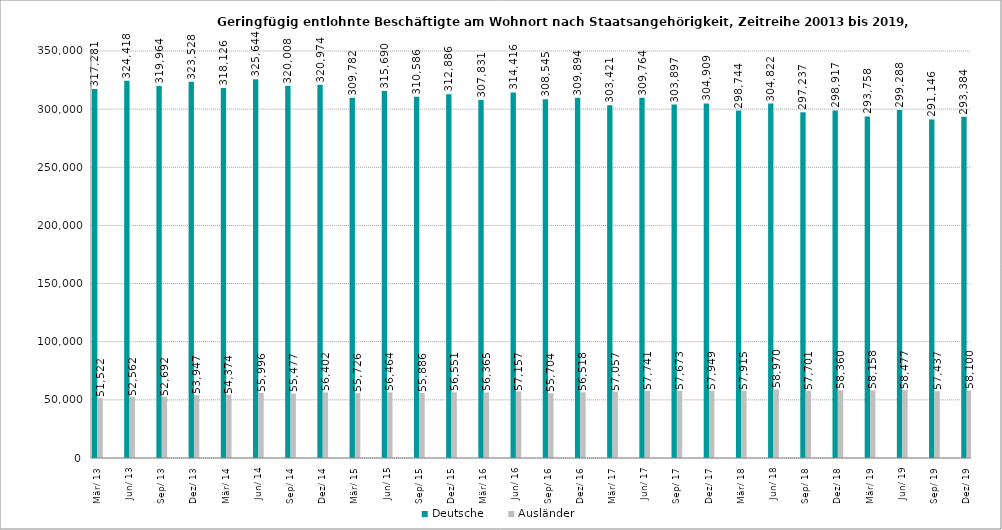
| Category | Deutsche | Ausländer |
|---|---|---|
| 2013-03-31 | 317281 | 51522 |
| 2013-06-30 | 324418 | 52562 |
| 2013-09-30 | 319964 | 52692 |
| 2013-12-31 | 323528 | 53947 |
| 2014-03-31 | 318126 | 54374 |
| 2014-06-30 | 325644 | 55996 |
| 2014-09-30 | 320008 | 55477 |
| 2014-12-31 | 320974 | 56402 |
| 2015-03-31 | 309782 | 55726 |
| 2015-06-30 | 315690 | 56464 |
| 2015-09-30 | 310586 | 55886 |
| 2015-12-31 | 312886 | 56551 |
| 2016-03-31 | 307831 | 56365 |
| 2016-06-30 | 314416 | 57157 |
| 2016-09-30 | 308545 | 55704 |
| 2016-12-31 | 309894 | 56518 |
| 2017-03-31 | 303421 | 57057 |
| 2017-06-30 | 309764 | 57741 |
| 2017-09-30 | 303897 | 57673 |
| 2017-12-31 | 304909 | 57949 |
| 2018-03-31 | 298744 | 57915 |
| 2018-06-30 | 304822 | 58970 |
| 2018-09-30 | 297237 | 57701 |
| 2018-12-31 | 298917 | 58360 |
| 2019-03-31 | 293758 | 58158 |
| 2019-06-30 | 299288 | 58477 |
| 2019-09-30 | 291146 | 57437 |
| 2019-12-31 | 293384 | 58100 |